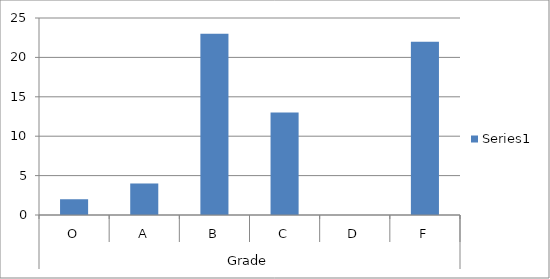
| Category | Series 0 |
|---|---|
| 0 | 2 |
| 1 | 4 |
| 2 | 23 |
| 3 | 13 |
| 4 | 0 |
| 5 | 22 |